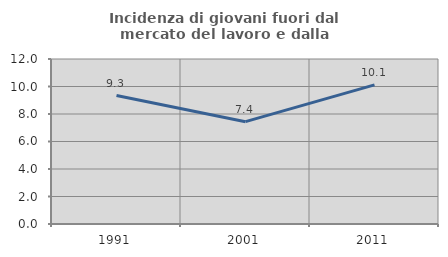
| Category | Incidenza di giovani fuori dal mercato del lavoro e dalla formazione  |
|---|---|
| 1991.0 | 9.343 |
| 2001.0 | 7.443 |
| 2011.0 | 10.117 |